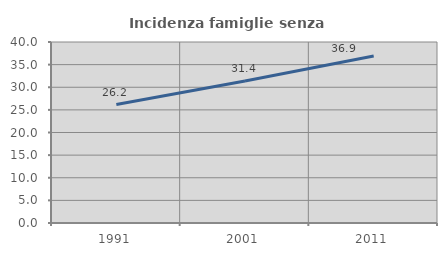
| Category | Incidenza famiglie senza nuclei |
|---|---|
| 1991.0 | 26.18 |
| 2001.0 | 31.394 |
| 2011.0 | 36.924 |